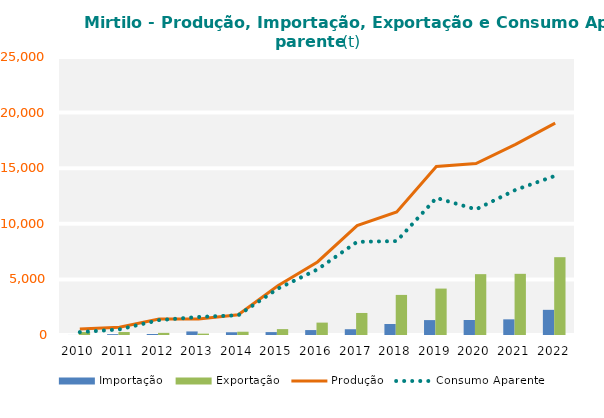
| Category | Importação | Exportação |
|---|---|---|
| 2010 | 3.052 | 274.536 |
| 2011 | 77.08 | 270.617 |
| 2012 | 93.3 | 192.288 |
| 2013 | 320.409 | 127.164 |
| 2014 | 246.818 | 293.821 |
| 2015 | 262.093 | 529.786 |
| 2016 | 443.485 | 1113.829 |
| 2017 | 518.729 | 1981.36 |
| 2018 | 989.626 | 3605.127 |
| 2019 | 1340.381 | 4174.563 |
| 2020 | 1350.891 | 5472.329 |
| 2021 | 1408.458 | 5500.785 |
| 2022 | 2262.749 | 6997.691 |